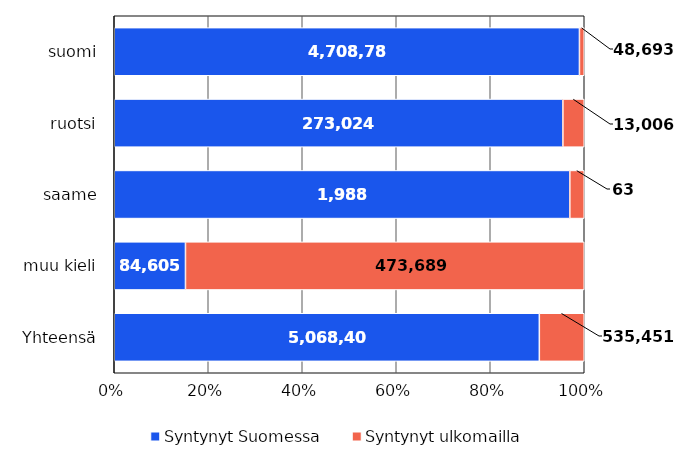
| Category | Syntynyt Suomessa | Syntynyt ulkomailla |
|---|---|---|
| suomi | 4708783 | 48693 |
| ruotsi | 273024 | 13006 |
| saame | 1988 | 63 |
| muu kieli | 84605 | 473689 |
| Yhteensä | 5068400 | 535451 |